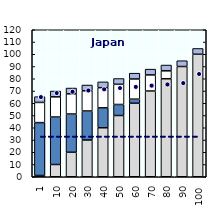
| Category | Gross earnings | Social assistance | Housing benefits | Family benefits | In-work benefits |
|---|---|---|---|---|---|
| 1.0 | 1 | 43.189 | 16.476 | 4.721 | 0 |
| 10.0 | 10 | 38.767 | 16.476 | 4.721 | 0 |
| 20.0 | 20 | 31.229 | 16.476 | 4.721 | 0 |
| 30.0 | 30 | 23.691 | 16.476 | 4.721 | 0 |
| 40.0 | 40 | 16.254 | 16.476 | 4.721 | 0 |
| 50.0 | 50 | 9.001 | 16.476 | 4.721 | 0 |
| 60.0 | 60 | 3.347 | 16.476 | 4.721 | 0 |
| 70.0 | 70 | 0 | 13.127 | 4.721 | 0 |
| 80.0 | 80 | 0 | 6.476 | 4.721 | 0 |
| 90.0 | 90 | 0 | 0 | 4.721 | 0 |
| 100.0 | 100 | 0 | 0 | 4.721 | 0 |